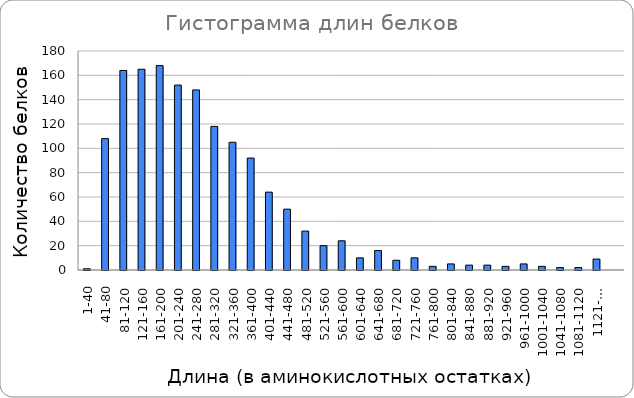
| Category | Series 0 |
|---|---|
| 1-40 | 1 |
| 41-80 | 108 |
| 81-120 | 164 |
| 121-160 | 165 |
| 161-200 | 168 |
| 201-240 | 152 |
| 241-280 | 148 |
| 281-320 | 118 |
| 321-360 | 105 |
| 361-400 | 92 |
| 401-440 | 64 |
| 441-480 | 50 |
| 481-520 | 32 |
| 521-560 | 20 |
| 561-600 | 24 |
| 601-640 | 10 |
| 641-680 | 16 |
| 681-720 | 8 |
| 721-760 | 10 |
| 761-800 | 3 |
| 801-840 | 5 |
| 841-880 | 4 |
| 881-920 | 4 |
| 921-960 | 3 |
| 961-1000 | 5 |
| 1001-1040 | 3 |
| 1041-1080 | 2 |
| 1081-1120 | 2 |
| 1121-... | 9 |